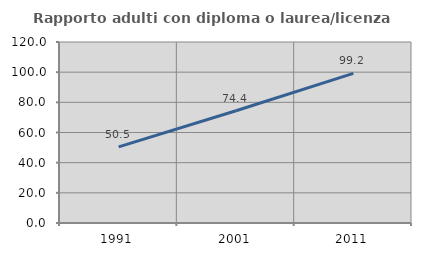
| Category | Rapporto adulti con diploma o laurea/licenza media  |
|---|---|
| 1991.0 | 50.495 |
| 2001.0 | 74.425 |
| 2011.0 | 99.211 |